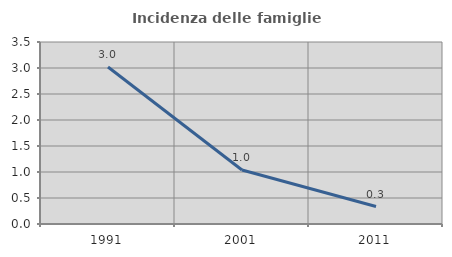
| Category | Incidenza delle famiglie numerose |
|---|---|
| 1991.0 | 3.019 |
| 2001.0 | 1.038 |
| 2011.0 | 0.336 |